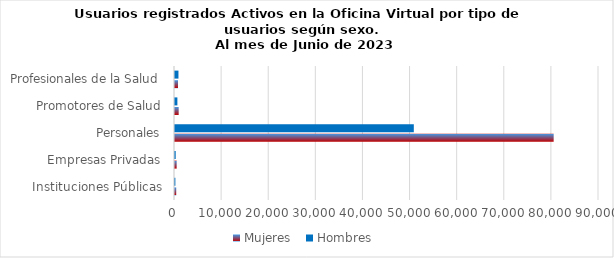
| Category | Mujeres | Hombres |
|---|---|---|
| Instituciones Públicas | 261 | 80 |
| Empresas Privadas | 354 | 148 |
| Personales | 80377 | 50691 |
| Promotores de Salud | 780 | 506 |
| Profesionales de la Salud | 631 | 734 |